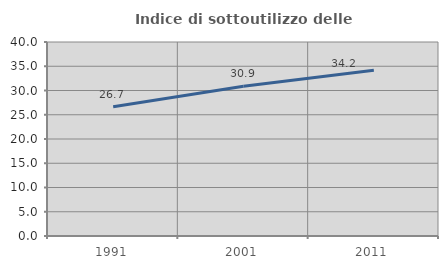
| Category | Indice di sottoutilizzo delle abitazioni  |
|---|---|
| 1991.0 | 26.662 |
| 2001.0 | 30.882 |
| 2011.0 | 34.178 |